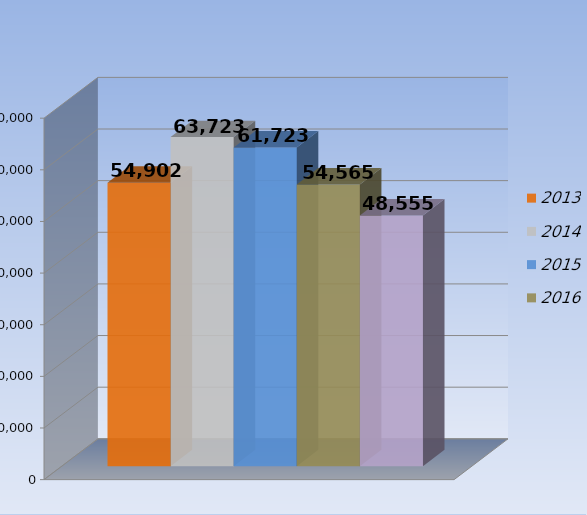
| Category | 2013 | 2014 | 2015 | 2016 | 2017 |
|---|---|---|---|---|---|
| 0 | 54902 | 63723 | 61723 | 54565 | 48555 |